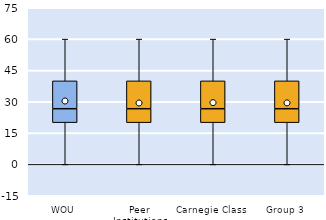
| Category | 25th | 50th | 75th |
|---|---|---|---|
| WOU | 20 | 6.667 | 13.333 |
| Peer Institutions | 20 | 6.667 | 13.333 |
| Carnegie Class | 20 | 6.667 | 13.333 |
| Group 3 | 20 | 6.667 | 13.333 |